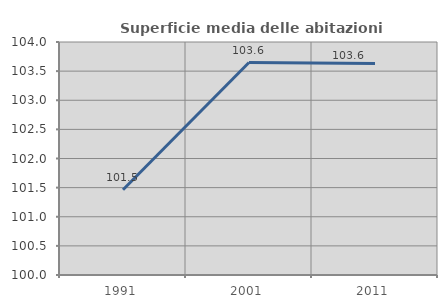
| Category | Superficie media delle abitazioni occupate |
|---|---|
| 1991.0 | 101.465 |
| 2001.0 | 103.648 |
| 2011.0 | 103.63 |